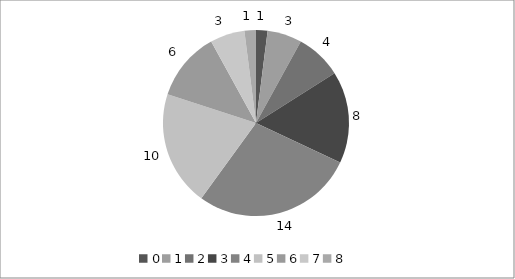
| Category | 0 1 2 3 4 5 6 7 8 |
|---|---|
| 0.0 | 1 |
| 1.0 | 3 |
| 2.0 | 4 |
| 3.0 | 8 |
| 4.0 | 14 |
| 5.0 | 10 |
| 6.0 | 6 |
| 7.0 | 3 |
| 8.0 | 1 |